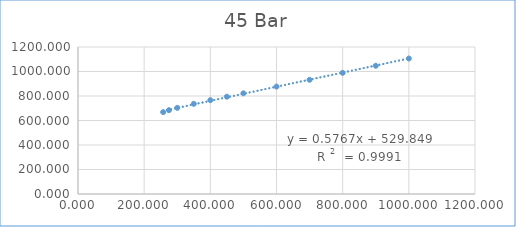
| Category | Series 0 |
|---|---|
| 257.4 | 668.395 |
| 275.0 | 684.257 |
| 300.0 | 703.344 |
| 350.0 | 736.144 |
| 400.0 | 765.791 |
| 450.0 | 794.123 |
| 500.0 | 821.882 |
| 600.0 | 876.947 |
| 700.0 | 932.465 |
| 800.0 | 989.011 |
| 900.0 | 1046.847 |
| 1000.0 | 1106.02 |